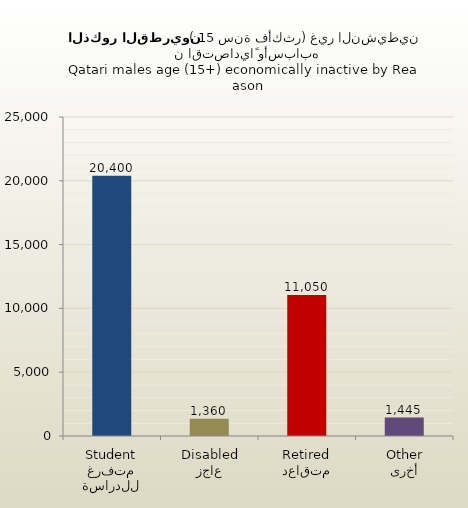
| Category | الذكور القطريين |
|---|---|
| متفرغ للدراسة
Student | 20400 |
| عاجز
Disabled | 1360 |
| متقاعد
Retired | 11050 |
| أخرى
Other | 1445 |